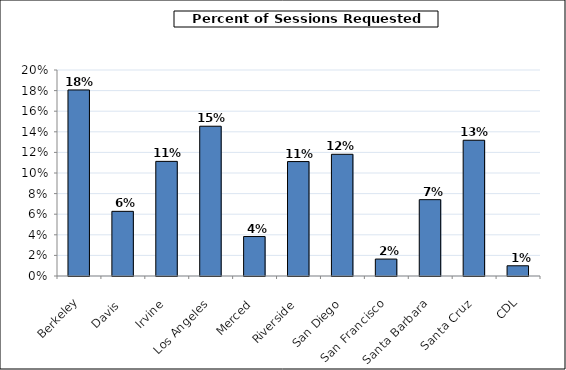
| Category | Sessions requested (by campus) |
|---|---|
| Berkeley | 0.181 |
| Davis | 0.063 |
| Irvine | 0.111 |
| Los Angeles | 0.145 |
| Merced | 0.038 |
| Riverside | 0.111 |
| San Diego | 0.118 |
| San Francisco | 0.016 |
| Santa Barbara | 0.074 |
| Santa Cruz | 0.132 |
| CDL | 0.01 |